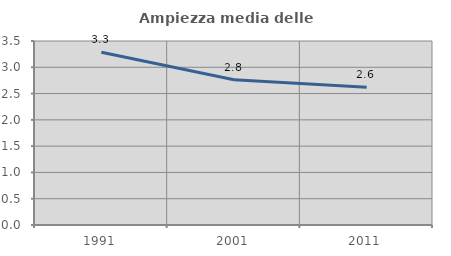
| Category | Ampiezza media delle famiglie |
|---|---|
| 1991.0 | 3.288 |
| 2001.0 | 2.763 |
| 2011.0 | 2.621 |